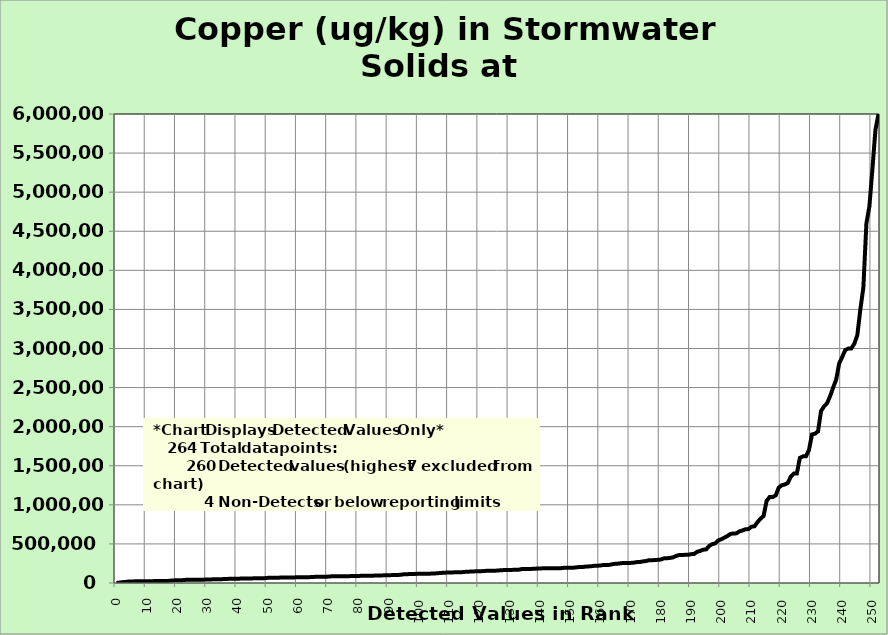
| Category | Copper |
|---|---|
| 0.0 | 509 |
| 1.0 | 5000 |
| 2.0 | 11000 |
| 3.0 | 14000 |
| 4.0 | 18700 |
| 5.0 | 19700 |
| 6.0 | 20800 |
| 7.0 | 20900 |
| 8.0 | 22200 |
| 9.0 | 22600 |
| 10.0 | 22800 |
| 11.0 | 23000 |
| 12.0 | 23900 |
| 13.0 | 24200 |
| 14.0 | 25500 |
| 15.0 | 25800 |
| 16.0 | 26000 |
| 17.0 | 26200 |
| 18.0 | 30500 |
| 19.0 | 33000 |
| 20.0 | 34900 |
| 21.0 | 35700 |
| 22.0 | 36800 |
| 23.0 | 40500 |
| 24.0 | 41000 |
| 25.0 | 41600 |
| 26.0 | 41700 |
| 27.0 | 42800 |
| 28.0 | 42900 |
| 29.0 | 43100 |
| 30.0 | 44400 |
| 31.0 | 46200 |
| 32.0 | 46500 |
| 33.0 | 47100 |
| 34.0 | 49400 |
| 35.0 | 49500 |
| 36.0 | 50800 |
| 37.0 | 52800 |
| 38.0 | 53600 |
| 39.0 | 54300 |
| 40.0 | 55200 |
| 41.0 | 56200 |
| 42.0 | 56300 |
| 43.0 | 56900 |
| 44.0 | 57500 |
| 45.0 | 59100 |
| 46.0 | 59700 |
| 47.0 | 60900 |
| 48.0 | 61400 |
| 49.0 | 62100 |
| 50.0 | 65800 |
| 51.0 | 66200 |
| 52.0 | 67000 |
| 53.0 | 67100 |
| 54.0 | 68900 |
| 55.0 | 69700 |
| 56.0 | 69800 |
| 57.0 | 70300 |
| 58.0 | 71100 |
| 59.0 | 71900 |
| 60.0 | 73000 |
| 61.0 | 73100 |
| 62.0 | 74200 |
| 63.0 | 75000 |
| 64.0 | 75100 |
| 65.0 | 78000 |
| 66.0 | 78700 |
| 67.0 | 78900 |
| 68.0 | 79900 |
| 69.0 | 80000 |
| 70.0 | 81900 |
| 71.0 | 85000 |
| 72.0 | 85300 |
| 73.0 | 85300 |
| 74.0 | 86000 |
| 75.0 | 86400 |
| 76.0 | 87200 |
| 77.0 | 87800 |
| 78.0 | 89100 |
| 79.0 | 89400 |
| 80.0 | 90500 |
| 81.0 | 91500 |
| 82.0 | 93000 |
| 83.0 | 93000 |
| 84.0 | 93900 |
| 85.0 | 94200 |
| 86.0 | 95900 |
| 87.0 | 96100 |
| 88.0 | 97300 |
| 89.0 | 99300 |
| 90.0 | 99800 |
| 91.0 | 101000 |
| 92.0 | 102000 |
| 93.0 | 103000 |
| 94.0 | 105000 |
| 95.0 | 112000 |
| 96.0 | 112000 |
| 97.0 | 115000 |
| 98.0 | 115000 |
| 99.0 | 117000 |
| 100.0 | 117000 |
| 101.0 | 118000 |
| 102.0 | 118000 |
| 103.0 | 119000 |
| 104.0 | 120000 |
| 105.0 | 122000 |
| 106.0 | 124000 |
| 107.0 | 128000 |
| 108.0 | 131000 |
| 109.0 | 133000 |
| 110.0 | 135000 |
| 111.0 | 135000 |
| 112.0 | 137000 |
| 113.0 | 137000 |
| 114.0 | 137000 |
| 115.0 | 142000 |
| 116.0 | 144000 |
| 117.0 | 146000 |
| 118.0 | 147000 |
| 119.0 | 151000 |
| 120.0 | 151000 |
| 121.0 | 152000 |
| 122.0 | 155000 |
| 123.0 | 156000 |
| 124.0 | 156000 |
| 125.0 | 157000 |
| 126.0 | 159000 |
| 127.0 | 163000 |
| 128.0 | 165000 |
| 129.0 | 165000 |
| 130.0 | 165000 |
| 131.0 | 168000 |
| 132.0 | 168000 |
| 133.0 | 170000 |
| 134.0 | 178000 |
| 135.0 | 179000 |
| 136.0 | 180000 |
| 137.0 | 180000 |
| 138.0 | 182000 |
| 139.0 | 184000 |
| 140.0 | 185000 |
| 141.0 | 188000 |
| 142.0 | 188000 |
| 143.0 | 189000 |
| 144.0 | 190000 |
| 145.0 | 190000 |
| 146.0 | 190000 |
| 147.0 | 190000 |
| 148.0 | 194000 |
| 149.0 | 194000 |
| 150.0 | 194000 |
| 151.0 | 195000 |
| 152.0 | 200000 |
| 153.0 | 204000 |
| 154.0 | 204000 |
| 155.0 | 209000 |
| 156.0 | 212000 |
| 157.0 | 214000 |
| 158.0 | 220000 |
| 159.0 | 221000 |
| 160.0 | 224000 |
| 161.0 | 230000 |
| 162.0 | 230000 |
| 163.0 | 232000 |
| 164.0 | 240000 |
| 165.0 | 247000 |
| 166.0 | 248000 |
| 167.0 | 254000 |
| 168.0 | 255000 |
| 169.0 | 256000 |
| 170.0 | 257000 |
| 171.0 | 260000 |
| 172.0 | 267000 |
| 173.0 | 268000 |
| 174.0 | 276000 |
| 175.0 | 280000 |
| 176.0 | 290000 |
| 177.0 | 290000 |
| 178.0 | 294000 |
| 179.0 | 296000 |
| 180.0 | 300000 |
| 181.0 | 315000 |
| 182.0 | 316000 |
| 183.0 | 321000 |
| 184.0 | 327000 |
| 185.0 | 345000 |
| 186.0 | 357000 |
| 187.0 | 359000 |
| 188.0 | 360000 |
| 189.0 | 360000 |
| 190.0 | 369000 |
| 191.0 | 371000 |
| 192.0 | 399000 |
| 193.0 | 410000 |
| 194.0 | 426000 |
| 195.0 | 430000 |
| 196.0 | 474000 |
| 197.0 | 497000 |
| 198.0 | 507000 |
| 199.0 | 544000 |
| 200.0 | 560000 |
| 201.0 | 580000 |
| 202.0 | 600000 |
| 203.0 | 627000 |
| 204.0 | 634000 |
| 205.0 | 635000 |
| 206.0 | 660000 |
| 207.0 | 672000 |
| 208.0 | 687000 |
| 209.0 | 690000 |
| 210.0 | 720000 |
| 211.0 | 726000 |
| 212.0 | 780000 |
| 213.0 | 823000 |
| 214.0 | 858000 |
| 215.0 | 1050000 |
| 216.0 | 1100000 |
| 217.0 | 1100000 |
| 218.0 | 1120000 |
| 219.0 | 1220000 |
| 220.0 | 1250000 |
| 221.0 | 1260000 |
| 222.0 | 1280000 |
| 223.0 | 1360000 |
| 224.0 | 1400000 |
| 225.0 | 1400000 |
| 226.0 | 1600000 |
| 227.0 | 1620000 |
| 228.0 | 1620000 |
| 229.0 | 1700000 |
| 230.0 | 1900000 |
| 231.0 | 1910000 |
| 232.0 | 1940000 |
| 233.0 | 2200000 |
| 234.0 | 2260000 |
| 235.0 | 2300000 |
| 236.0 | 2390000 |
| 237.0 | 2500000 |
| 238.0 | 2600000 |
| 239.0 | 2810000 |
| 240.0 | 2890000 |
| 241.0 | 2980000 |
| 242.0 | 2999000 |
| 243.0 | 3000000 |
| 244.0 | 3060000 |
| 245.0 | 3170000 |
| 246.0 | 3500000 |
| 247.0 | 3780000 |
| 248.0 | 4600000 |
| 249.0 | 4820000 |
| 250.0 | 5300000 |
| 251.0 | 5800000 |
| 252.0 | 6000000 |